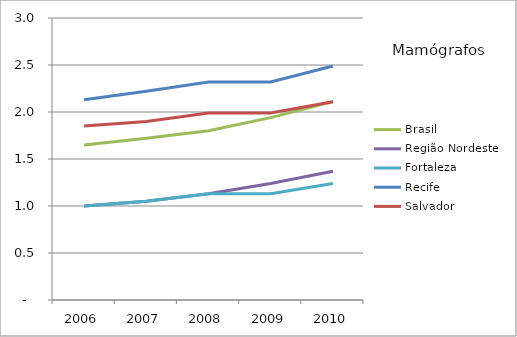
| Category | Brasil | Região Nordeste | Fortaleza | Recife | Salvador |
|---|---|---|---|---|---|
| 2006.0 | 1.65 | 1 | 1 | 2.13 | 1.85 |
| 2007.0 | 1.72 | 1.05 | 1.05 | 2.22 | 1.9 |
| 2008.0 | 1.8 | 1.13 | 1.13 | 2.32 | 1.99 |
| 2009.0 | 1.94 | 1.24 | 1.13 | 2.32 | 1.99 |
| 2010.0 | 2.11 | 1.37 | 1.24 | 2.49 | 2.11 |